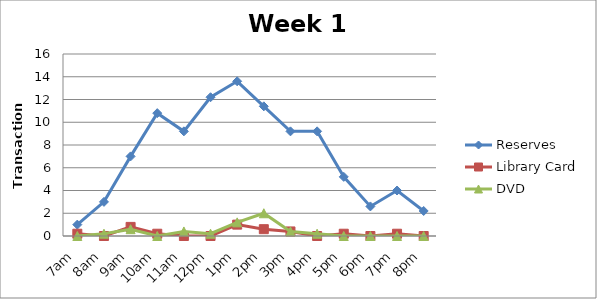
| Category | Reserves | Library Card | DVD |
|---|---|---|---|
| 7am | 1 | 0.2 | 0 |
| 8am | 3 | 0 | 0.2 |
| 9am | 7 | 0.8 | 0.6 |
| 10am | 10.8 | 0.2 | 0 |
| 11am | 9.2 | 0 | 0.4 |
| 12pm | 12.2 | 0 | 0.2 |
| 1pm | 13.6 | 1 | 1.2 |
| 2pm | 11.4 | 0.6 | 2 |
| 3pm | 9.2 | 0.4 | 0.4 |
| 4pm | 9.2 | 0 | 0.2 |
| 5pm | 5.2 | 0.2 | 0 |
| 6pm | 2.6 | 0 | 0 |
| 7pm | 4 | 0.2 | 0 |
| 8pm | 2.2 | 0 | 0 |